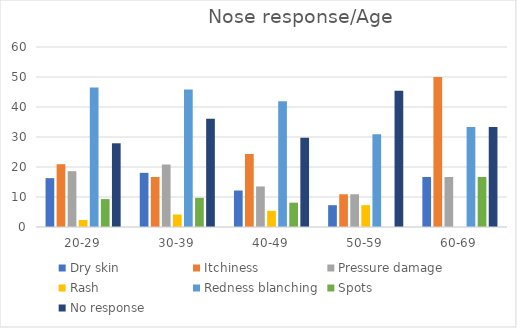
| Category | Dry skin | Itchiness | Pressure damage | Rash | Redness blanching | Spots | No response |
|---|---|---|---|---|---|---|---|
| 20-29 | 16.279 | 20.93 | 18.605 | 2.326 | 46.512 | 9.302 | 27.907 |
| 30-39 | 18.056 | 16.667 | 20.833 | 4.167 | 45.833 | 9.722 | 36.111 |
| 40-49 | 12.162 | 24.324 | 13.514 | 5.405 | 41.892 | 8.108 | 29.73 |
| 50-59 | 7.273 | 10.909 | 10.909 | 7.273 | 30.909 | 0 | 45.455 |
| 60-69 | 16.667 | 50 | 16.667 | 0 | 33.333 | 16.667 | 33.333 |